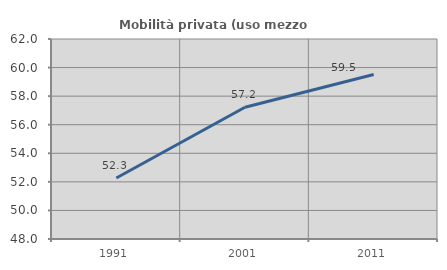
| Category | Mobilità privata (uso mezzo privato) |
|---|---|
| 1991.0 | 52.268 |
| 2001.0 | 57.224 |
| 2011.0 | 59.52 |